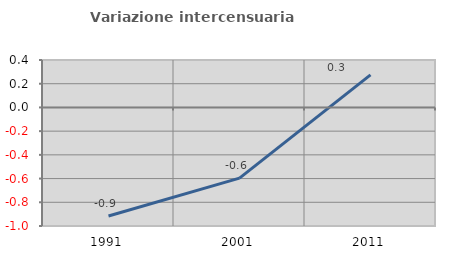
| Category | Variazione intercensuaria annua |
|---|---|
| 1991.0 | -0.916 |
| 2001.0 | -0.596 |
| 2011.0 | 0.274 |